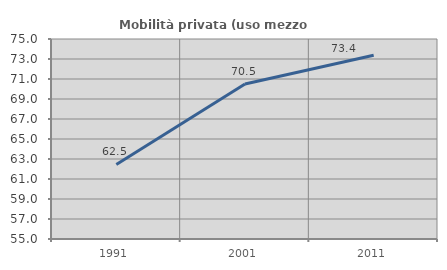
| Category | Mobilità privata (uso mezzo privato) |
|---|---|
| 1991.0 | 62.45 |
| 2001.0 | 70.494 |
| 2011.0 | 73.371 |